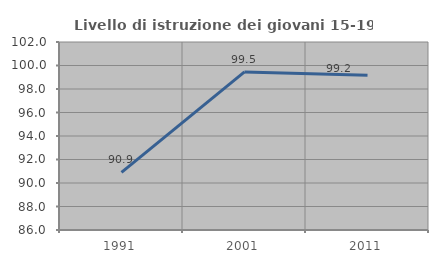
| Category | Livello di istruzione dei giovani 15-19 anni |
|---|---|
| 1991.0 | 90.909 |
| 2001.0 | 99.454 |
| 2011.0 | 99.17 |